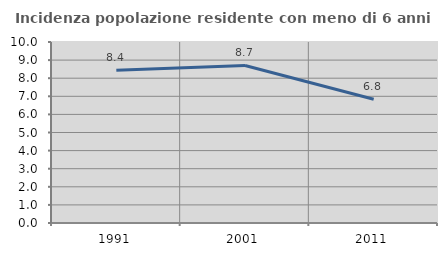
| Category | Incidenza popolazione residente con meno di 6 anni |
|---|---|
| 1991.0 | 8.446 |
| 2001.0 | 8.704 |
| 2011.0 | 6.84 |